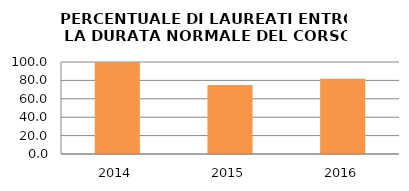
| Category | 2014 2015 2016 |
|---|---|
| 2014.0 | 100 |
| 2015.0 | 75 |
| 2016.0 | 81.818 |